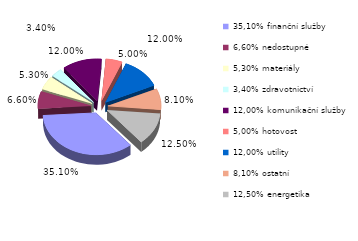
| Category | Series 0 |
|---|---|
| 35,10% finanční služby | 0.351 |
| 6,60% nedostupné | 0.066 |
| 5,30% materiály | 0.053 |
| 3,40% zdravotnictví | 0.034 |
| 12,00% komunikační služby | 0.12 |
| 5,00% hotovost | 0.05 |
| 12,00% utility | 0.12 |
| 8,10% ostatní | 0.081 |
| 12,50% energetika | 0.125 |